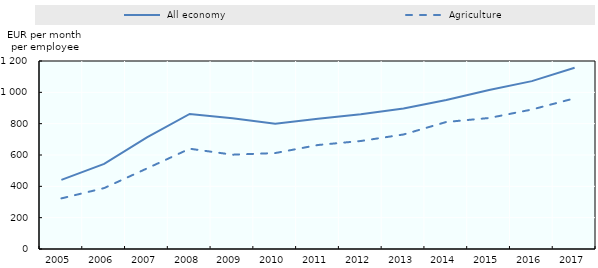
| Category |  All economy |  Agriculture |
|---|---|---|
| 2005.0 | 441.56 | 323.03 |
| 2006.0 | 543.52 | 388.79 |
| 2007.0 | 712.8 | 514.13 |
| 2008.0 | 861.92 | 640.04 |
| 2009.0 | 833.92 | 602.02 |
| 2010.0 | 799.11 | 612.42 |
| 2011.0 | 830.96 | 663.81 |
| 2012.0 | 859.53 | 689.35 |
| 2013.0 | 896.82 | 730.97 |
| 2014.0 | 950.79 | 810.8 |
| 2015.0 | 1014.83 | 836.15 |
| 2016.0 | 1071.48 | 890.28 |
| 2017.0 | 1156.63 | 961.98 |